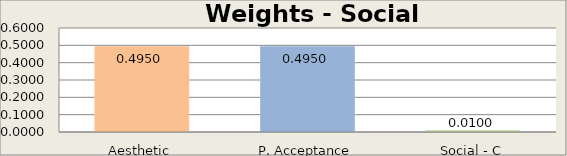
| Category | Social Module |
|---|---|
| Aesthetic | 0.495 |
| P. Acceptance | 0.495 |
| Social - C | 0.01 |